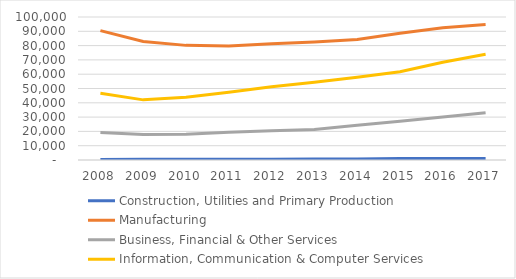
| Category | Construction, Utilities and Primary Production | Manufacturing  | Business, Financial & Other Services | Information, Communication & Computer Services |
|---|---|---|---|---|
| 2008.0 | 409 | 90477 | 19223 | 46609 |
| 2009.0 | 444 | 82838 | 17856 | 42057 |
| 2010.0 | 451 | 80161 | 17989 | 43884 |
| 2011.0 | 520 | 79649 | 19355 | 47322 |
| 2012.0 | 608 | 81303 | 20372 | 51257 |
| 2013.0 | 677 | 82466 | 21272 | 54316 |
| 2014.0 | 763 | 84267 | 24230 | 57841 |
| 2015.0 | 1112 | 88584 | 27087 | 61761 |
| 2016.0 | 1056 | 92477 | 30121 | 68310 |
| 2017.0 | 1064 | 94719 | 32997 | 73923 |